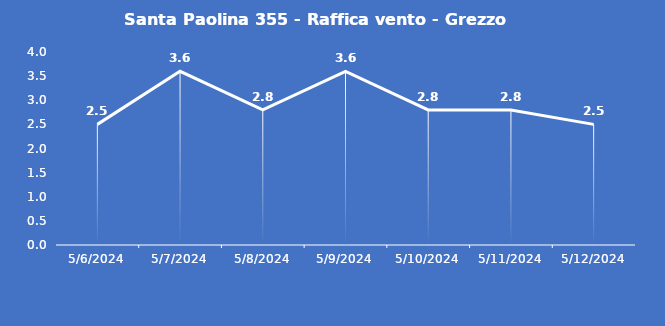
| Category | Santa Paolina 355 - Raffica vento - Grezzo (m/s) |
|---|---|
| 5/6/24 | 2.5 |
| 5/7/24 | 3.6 |
| 5/8/24 | 2.8 |
| 5/9/24 | 3.6 |
| 5/10/24 | 2.8 |
| 5/11/24 | 2.8 |
| 5/12/24 | 2.5 |